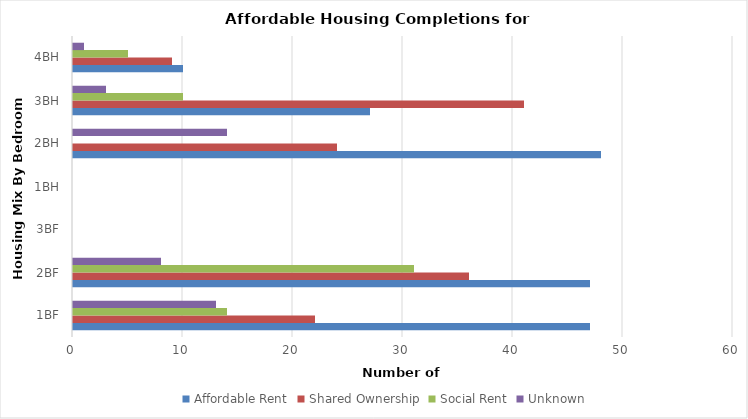
| Category | Affordable Rent | Shared Ownership | Social Rent | Unknown |
|---|---|---|---|---|
| 1BF | 47 | 22 | 14 | 13 |
| 2BF | 47 | 36 | 31 | 8 |
| 3BF | 0 | 0 | 0 | 0 |
| 1BH | 0 | 0 | 0 | 0 |
| 2BH | 48 | 24 | 0 | 14 |
| 3BH | 27 | 41 | 10 | 3 |
| 4BH | 10 | 9 | 5 | 1 |